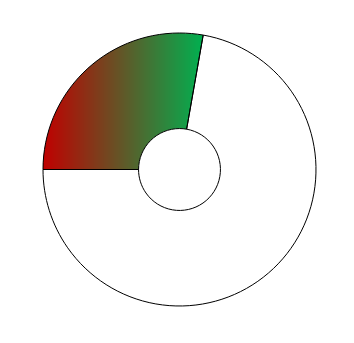
| Category | Series 0 |
|---|---|
| 0 | 100 |
| 1 | 260 |